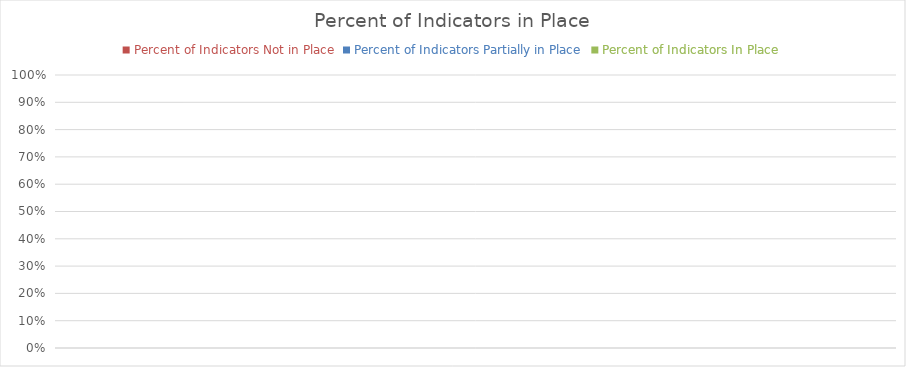
| Category | Percent of Indicators Not in Place | Percent of Indicators Partially in Place | Percent of Indicators In Place |
|---|---|---|---|
| 0 | 0 | 0 | 0 |
| 1 | 0 | 0 | 0 |
| 2 | 0 | 0 | 0 |
| 3 | 0 | 0 | 0 |
| 4 | 0 | 0 | 0 |
| 5 | 0 | 0 | 0 |